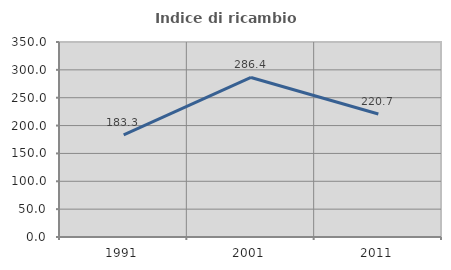
| Category | Indice di ricambio occupazionale  |
|---|---|
| 1991.0 | 183.333 |
| 2001.0 | 286.364 |
| 2011.0 | 220.69 |